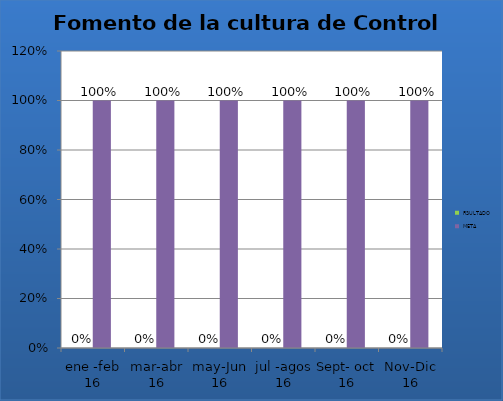
| Category | RSULTADO | META |
|---|---|---|
| ene -feb 16 | 0 | 1 |
| mar-abr 16 | 0 | 1 |
| may-Jun 16 | 0 | 1 |
| jul -agos 16 | 0 | 1 |
| Sept- oct 16 | 0 | 1 |
| Nov-Dic 16 | 0 | 1 |